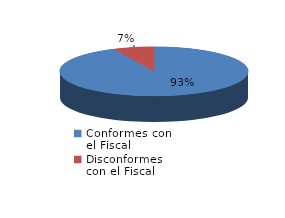
| Category | Series 0 |
|---|---|
| 0 | 213 |
| 1 | 16 |